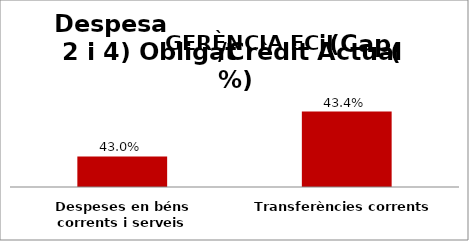
| Category | Series 0 |
|---|---|
| Despeses en béns corrents i serveis | 0.43 |
| Transferències corrents | 0.434 |